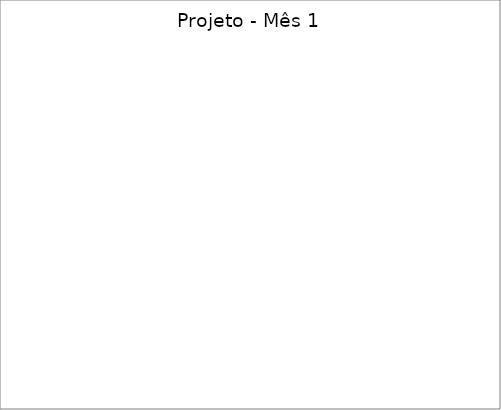
| Category | Series 0 |
|---|---|
| Projeto 1 [Coloque o nome do seu projeto] | 0 |
| Projeto 2 [Coloque o nome do seu projeto] | 0 |
| Projeto 3 [Coloque o nome do seu projeto] | 0 |
| Projeto 4 [Coloque o nome do seu projeto] | 0 |
| Projeto 5 [Coloque o nome do seu projeto] | 0 |